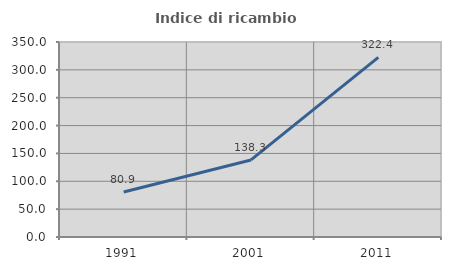
| Category | Indice di ricambio occupazionale  |
|---|---|
| 1991.0 | 80.87 |
| 2001.0 | 138.308 |
| 2011.0 | 322.414 |